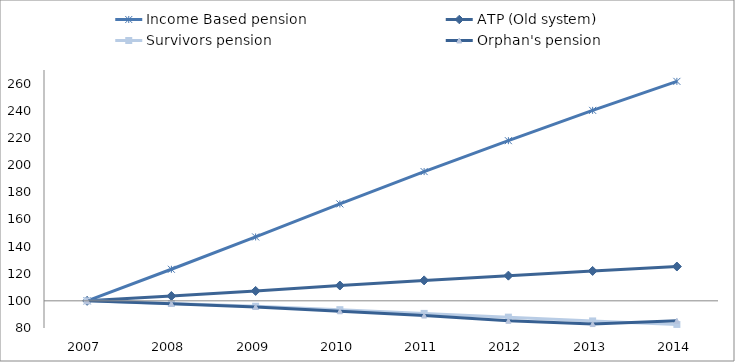
| Category | Income Based pension | ATP (Old system) | Survivors pension | Orphan's pension | 0 |
|---|---|---|---|---|---|
| 2007.0 | 100 | 100 | 100 | 100 |  |
| 2008.0 | 123.247 | 103.557 | 98.061 | 97.894 |  |
| 2009.0 | 147.068 | 107.304 | 96.012 | 95.555 |  |
| 2010.0 | 171.383 | 111.282 | 93.496 | 92.32 |  |
| 2011.0 | 195.186 | 115.065 | 90.755 | 89.164 |  |
| 2012.0 | 217.956 | 118.563 | 87.99 | 85.313 |  |
| 2013.0 | 240.276 | 122.028 | 85.203 | 82.907 |  |
| 2014.0 | 261.625 | 125.269 | 82.632 | 85.342 |  |